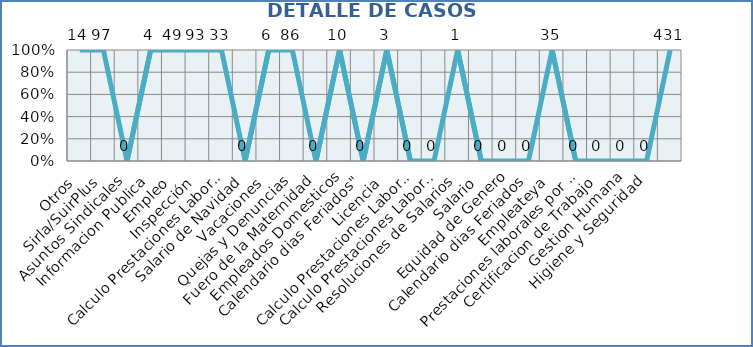
| Category | Series 0 |
|---|---|
| Otros | 14 |
| Sirla/SuirPlus | 4 |
| Asuntos Sindicales | 0 |
| Informacion Publica | 4 |
| Empleo | 49 |
| Inspección | 40 |
| Calculo Prestaciones Laborales | 2 |
| Salario de Navidad | 0 |
| Vacaciones | 6 |
| Quejas y Denuncias | 47 |
| Fuero de la Maternidad | 0 |
| Empleados Domesticos | 10 |
| Calendario dias Feriados" | 0 |
| Licencia | 3 |
| Calculo Prestaciones Laborales por quiebra empresa | 0 |
| Calculo Prestaciones Laborales por renuncia | 0 |
| Resoluciones de Salarios | 1 |
| Salario | 0 |
| Equidad de Genero | 0 |
| Calendario dias Feriados | 0 |
| Empleateya | 21 |
| Prestaciones laborales por venta empresa | 0 |
| Certificacion de Trabajo | 0 |
| Gestion Humana | 0 |
| Higiene y Seguridad | 0 |